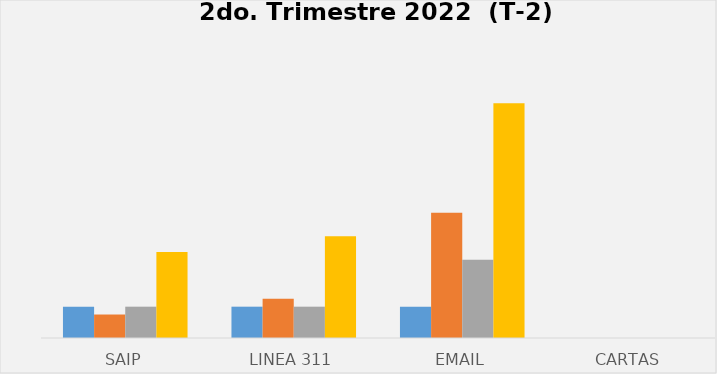
| Category | Series 0 | Series 1 | Series 2 | Series 3 |
|---|---|---|---|---|
| SAIP | 4 | 3 | 4 | 11 |
| Linea 311 | 4 | 5 | 4 | 13 |
| Email | 4 | 16 | 10 | 30 |
| Cartas | 0 | 0 | 0 | 0 |